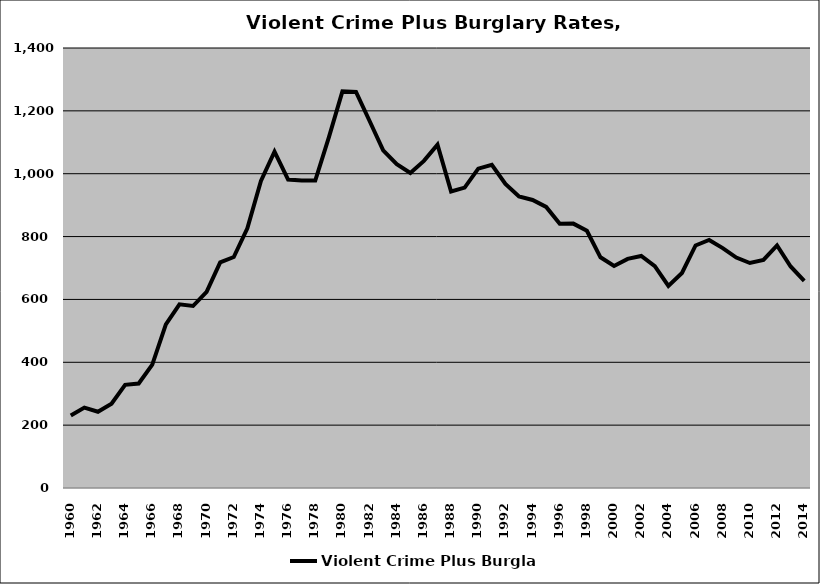
| Category | Violent Crime Plus Burglary |
|---|---|
| 1960.0 | 230.479 |
| 1961.0 | 255.818 |
| 1962.0 | 242.693 |
| 1963.0 | 268.308 |
| 1964.0 | 328.391 |
| 1965.0 | 332.577 |
| 1966.0 | 392.454 |
| 1967.0 | 520.649 |
| 1968.0 | 584.5 |
| 1969.0 | 579.069 |
| 1970.0 | 624.364 |
| 1971.0 | 717.806 |
| 1972.0 | 734.956 |
| 1973.0 | 826.001 |
| 1974.0 | 977.289 |
| 1975.0 | 1070.306 |
| 1976.0 | 981.471 |
| 1977.0 | 978.435 |
| 1978.0 | 978.478 |
| 1979.0 | 1115.36 |
| 1980.0 | 1261.932 |
| 1981.0 | 1260.118 |
| 1982.0 | 1167.702 |
| 1983.0 | 1074.511 |
| 1984.0 | 1030.676 |
| 1985.0 | 1002.45 |
| 1986.0 | 1040.815 |
| 1987.0 | 1092.49 |
| 1988.0 | 943.536 |
| 1989.0 | 955.763 |
| 1990.0 | 1016.054 |
| 1991.0 | 1028.537 |
| 1992.0 | 967.665 |
| 1993.0 | 927.372 |
| 1994.0 | 916.411 |
| 1995.0 | 894.3 |
| 1996.0 | 840.988 |
| 1997.0 | 841.219 |
| 1998.0 | 818.319 |
| 1999.0 | 734.052 |
| 2000.0 | 706.288 |
| 2001.0 | 729.067 |
| 2002.0 | 738.351 |
| 2003.0 | 706.028 |
| 2004.0 | 643.26 |
| 2005.0 | 684.107 |
| 2006.0 | 771.636 |
| 2007.0 | 789.108 |
| 2008.0 | 763.273 |
| 2009.0 | 733.239 |
| 2010.0 | 715.81 |
| 2011.0 | 725.677 |
| 2012.0 | 771.851 |
| 2013.0 | 704.794 |
| 2014.0 | 658.786 |